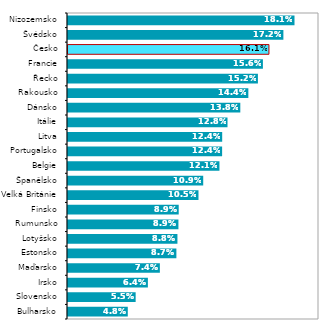
| Category | 2016 |
|---|---|
| Bulharsko | 0.048 |
| Slovensko | 0.055 |
| Irsko | 0.064 |
| Maďarsko | 0.074 |
| Estonsko | 0.087 |
| Lotyšsko | 0.088 |
| Rumunsko | 0.089 |
| Finsko | 0.089 |
| Velká Británie | 0.105 |
| Španělsko | 0.109 |
| Belgie | 0.121 |
| Portugalsko | 0.124 |
| Litva | 0.124 |
| Itálie | 0.128 |
| Dánsko | 0.138 |
| Rakousko | 0.144 |
| Řecko | 0.152 |
| Francie | 0.156 |
| Česko | 0.161 |
| Švédsko | 0.172 |
| Nizozemsko | 0.181 |